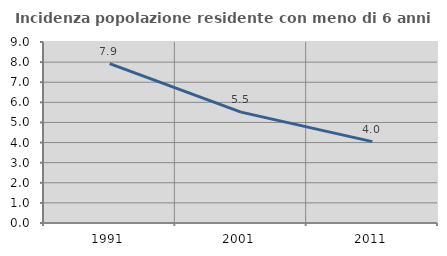
| Category | Incidenza popolazione residente con meno di 6 anni |
|---|---|
| 1991.0 | 7.928 |
| 2001.0 | 5.512 |
| 2011.0 | 4.046 |